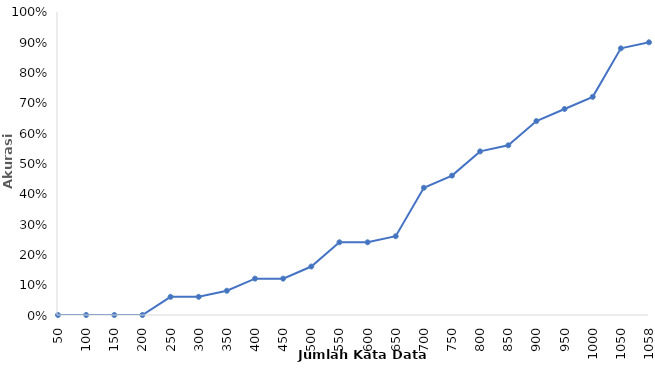
| Category | Series 0 |
|---|---|
| 50 | 0 |
| 100 | 0 |
| 150 | 0 |
| 200 | 0 |
| 250 | 0.06 |
| 300 | 0.06 |
| 350 | 0.08 |
| 400 | 0.12 |
| 450 | 0.12 |
| 500 | 0.16 |
| 550 | 0.24 |
| 600 | 0.24 |
| 650 | 0.26 |
| 700 | 0.42 |
| 750 | 0.46 |
| 800 | 0.54 |
| 850 | 0.56 |
| 900 | 0.64 |
| 950 | 0.68 |
| 1000 | 0.72 |
| 1050 | 0.88 |
| 1058 | 0.9 |